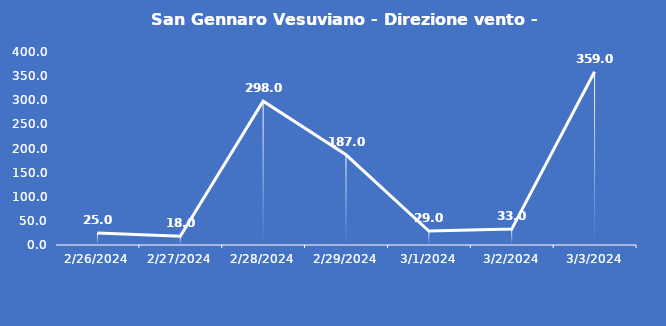
| Category | San Gennaro Vesuviano - Direzione vento - Grezzo (°N) |
|---|---|
| 2/26/24 | 25 |
| 2/27/24 | 18 |
| 2/28/24 | 298 |
| 2/29/24 | 187 |
| 3/1/24 | 29 |
| 3/2/24 | 33 |
| 3/3/24 | 359 |